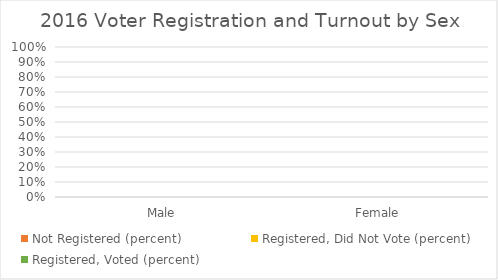
| Category | Not Registered (percent) | Registered, Did Not Vote (percent) | Registered, Voted (percent) |
|---|---|---|---|
| Male | 0 | 0 | 0 |
| Female | 0 | 0 | 0 |